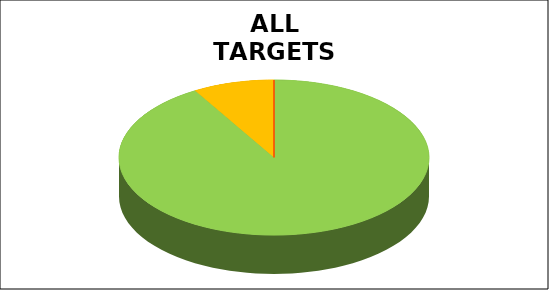
| Category | Series 0 |
|---|---|
| Green | 0.915 |
| Amber | 0.085 |
| Red | 0 |